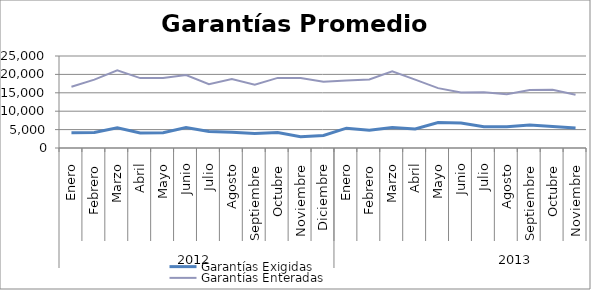
| Category | Garantías Exigidas | Garantías Enteradas |
|---|---|---|
| 0 | 4146.8 | 16662.483 |
| 1 | 4190.531 | 18572.749 |
| 2 | 5482.211 | 21128.648 |
| 3 | 4079.038 | 18997.51 |
| 4 | 4141.554 | 19005.364 |
| 5 | 5549.139 | 19818.91 |
| 6 | 4487.023 | 17351.39 |
| 7 | 4277.924 | 18719.955 |
| 8 | 3940.893 | 17217.403 |
| 9 | 4180.69 | 19046.939 |
| 10 | 3056.997 | 19028.425 |
| 11 | 3426.799 | 17994.819 |
| 12 | 5390.461 | 18317.043 |
| 13 | 4807.91 | 18608.477 |
| 14 | 5582.739 | 20850.446 |
| 15 | 5196.755 | 18583.166 |
| 16 | 6912.615 | 16266.455 |
| 17 | 6790.981 | 15108.06 |
| 18 | 5787.122 | 15161.964 |
| 19 | 5780.082 | 14588.597 |
| 20 | 6263.345 | 15743.621 |
| 21 | 5845.053 | 15824.978 |
| 22 | 5425.404 | 14459.931 |